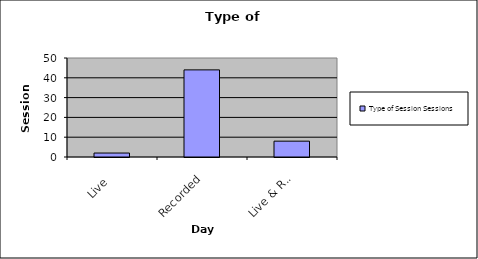
| Category | Type of Session |
|---|---|
| Live | 2 |
| Recorded | 44 |
| Live & Record. | 8 |